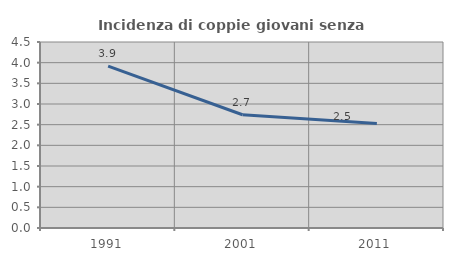
| Category | Incidenza di coppie giovani senza figli |
|---|---|
| 1991.0 | 3.916 |
| 2001.0 | 2.739 |
| 2011.0 | 2.525 |